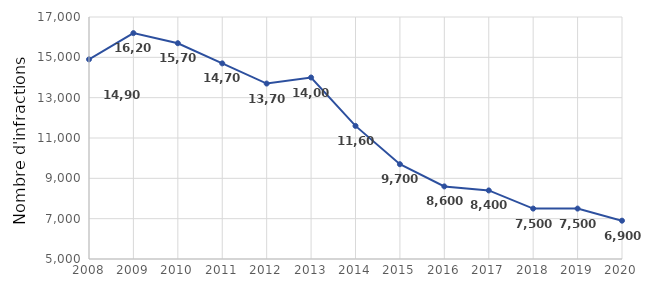
| Category | Series 0 |
|---|---|
| 2008.0 | 14900 |
| 2009.0 | 16200 |
| 2010.0 | 15700 |
| 2011.0 | 14700 |
| 2012.0 | 13700 |
| 2013.0 | 14000 |
| 2014.0 | 11600 |
| 2015.0 | 9700 |
| 2016.0 | 8600 |
| 2017.0 | 8400 |
| 2018.0 | 7500 |
| 2019.0 | 7500 |
| 2020.0 | 6900 |